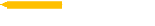
| Category | Difficult to select from many solutions |
|---|---|
| Difficult to select from many solutions | 2 |